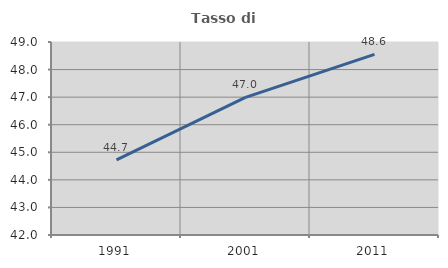
| Category | Tasso di occupazione   |
|---|---|
| 1991.0 | 44.722 |
| 2001.0 | 46.992 |
| 2011.0 | 48.553 |